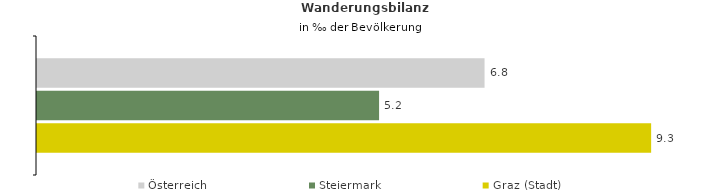
| Category | Österreich | Steiermark | Graz (Stadt) |
|---|---|---|---|
| Wanderungsrate in ‰ der Bevölkerung, Periode 2015-2019 | 6.771 | 5.175 | 9.291 |